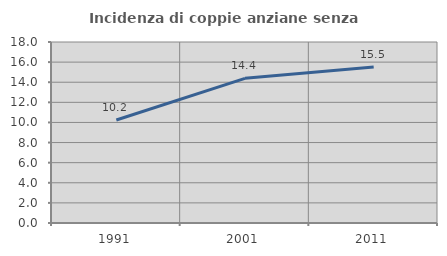
| Category | Incidenza di coppie anziane senza figli  |
|---|---|
| 1991.0 | 10.246 |
| 2001.0 | 14.385 |
| 2011.0 | 15.513 |